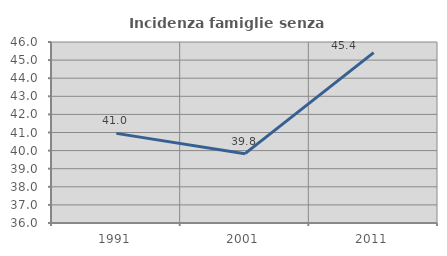
| Category | Incidenza famiglie senza nuclei |
|---|---|
| 1991.0 | 40.951 |
| 2001.0 | 39.83 |
| 2011.0 | 45.409 |